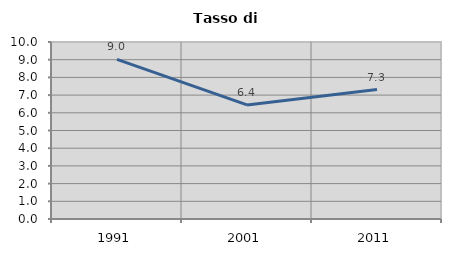
| Category | Tasso di disoccupazione   |
|---|---|
| 1991.0 | 9.016 |
| 2001.0 | 6.444 |
| 2011.0 | 7.312 |